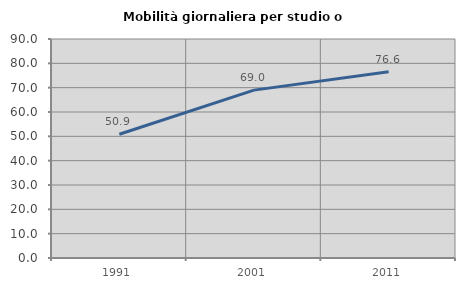
| Category | Mobilità giornaliera per studio o lavoro |
|---|---|
| 1991.0 | 50.873 |
| 2001.0 | 68.988 |
| 2011.0 | 76.579 |